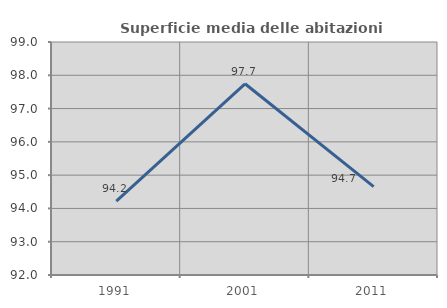
| Category | Superficie media delle abitazioni occupate |
|---|---|
| 1991.0 | 94.222 |
| 2001.0 | 97.745 |
| 2011.0 | 94.654 |